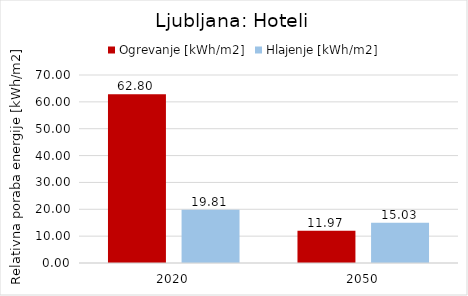
| Category | Ogrevanje [kWh/m2] | Hlajenje [kWh/m2] |
|---|---|---|
| 2020.0 | 62.803 | 19.808 |
| 2050.0 | 11.97 | 15.029 |